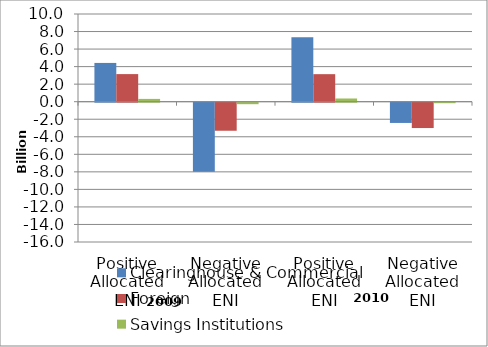
| Category | Clearinghouse & Commercial | Foreign | Savings Institutions |
|---|---|---|---|
| Positive Allocated ENI | 4419656361 | 3146937241 | 318266348 |
| Negative Allocated ENI | -7879844440 | -3198514157 | -170983511 |
| Positive Allocated ENI | 7338388297 | 3139766756 | 365097156 |
| Negative Allocated ENI | -2308836401 | -2890432405 | -57605000 |